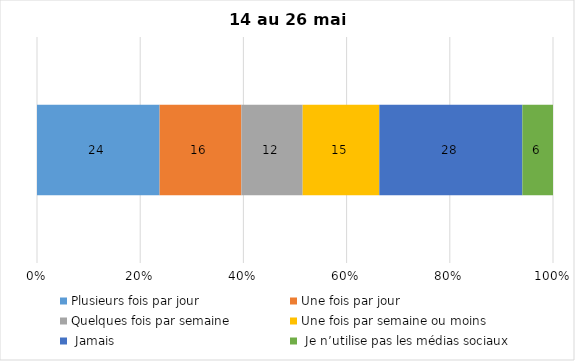
| Category | Plusieurs fois par jour | Une fois par jour | Quelques fois par semaine   | Une fois par semaine ou moins   |  Jamais   |  Je n’utilise pas les médias sociaux |
|---|---|---|---|---|---|---|
| 0 | 24 | 16 | 12 | 15 | 28 | 6 |